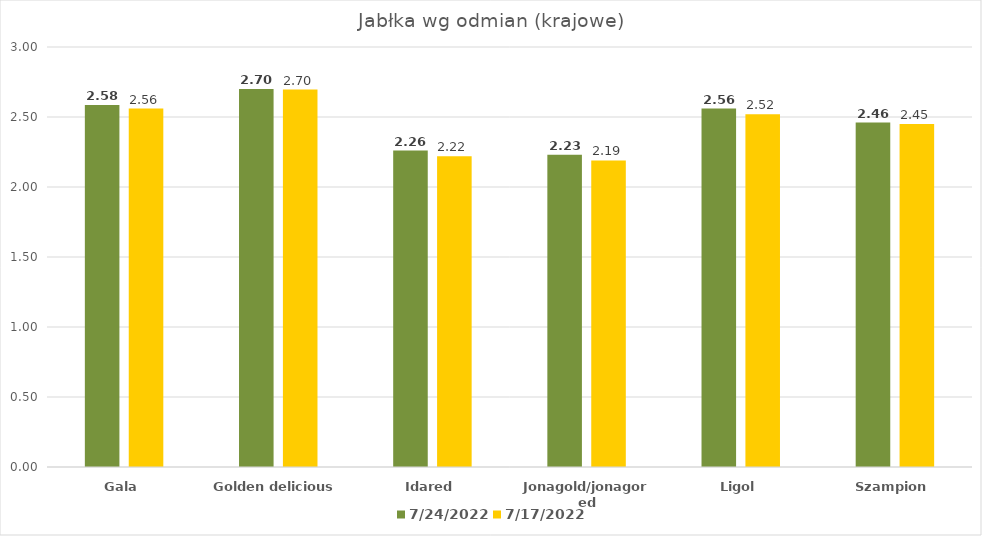
| Category | 24.07.2022 | 17.07.2022 |
|---|---|---|
| Gala | 2.585 | 2.56 |
| Golden delicious | 2.7 | 2.696 |
| Idared | 2.26 | 2.22 |
| Jonagold/jonagored | 2.23 | 2.19 |
| Ligol | 2.56 | 2.52 |
| Szampion | 2.46 | 2.45 |